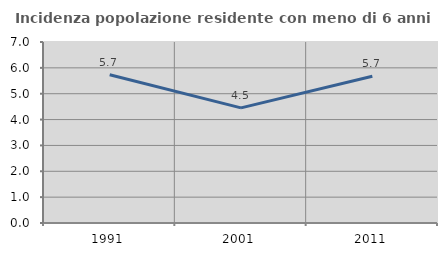
| Category | Incidenza popolazione residente con meno di 6 anni |
|---|---|
| 1991.0 | 5.732 |
| 2001.0 | 4.453 |
| 2011.0 | 5.673 |